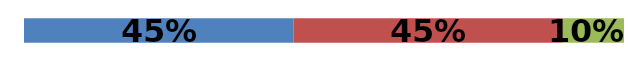
| Category | Series 0 | Series 1 | Series 2 |
|---|---|---|---|
| 0 | 0.449 | 0.449 | 0.102 |